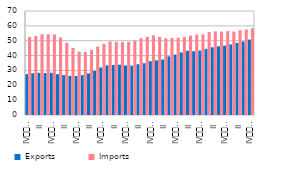
| Category | Exports | Imports |
|---|---|---|
| IV
2007 | 27.52 | 52.486 |
| I | 28.095 | 53.223 |
| II | 28.373 | 54.371 |
| III | 28.241 | 54.398 |
| IV
2008 | 28.407 | 54.15 |
| I | 27.454 | 52.258 |
| II | 26.854 | 48.553 |
| III | 26.281 | 45.145 |
| IV
2009 | 26.235 | 42.73 |
| I | 26.811 | 42.439 |
| II | 27.993 | 43.855 |
| III | 29.718 | 46.063 |
| IV
2010 | 31.987 | 47.885 |
| I | 33.434 | 49.373 |
| II | 33.717 | 49.311 |
| III | 33.872 | 49.026 |
| IV
2011 | 33.326 | 49.298 |
| I | 33.233 | 50.067 |
| II | 34.138 | 51.708 |
| III | 34.828 | 52.566 |
| IV
2012 | 36.212 | 53.649 |
| I | 36.743 | 52.584 |
| II | 37.354 | 51.617 |
| III | 39.462 | 51.759 |
| IV
2013 | 40.68 | 51.904 |
| I | 42.168 | 52.458 |
| II | 43.226 | 53.439 |
| III | 42.933 | 54.084 |
| IV
2014 | 43.376 | 54.318 |
| I | 44.488 | 55.767 |
| II | 45.526 | 56.306 |
| III | 46.21 | 56.153 |
| IV
2015 | 46.667 | 56.424 |
| I | 47.518 | 56.166 |
| II | 48.541 | 57.149 |
| III | 49.459 | 57.621 |
| IV
2016 | 50.753 | 58.32 |